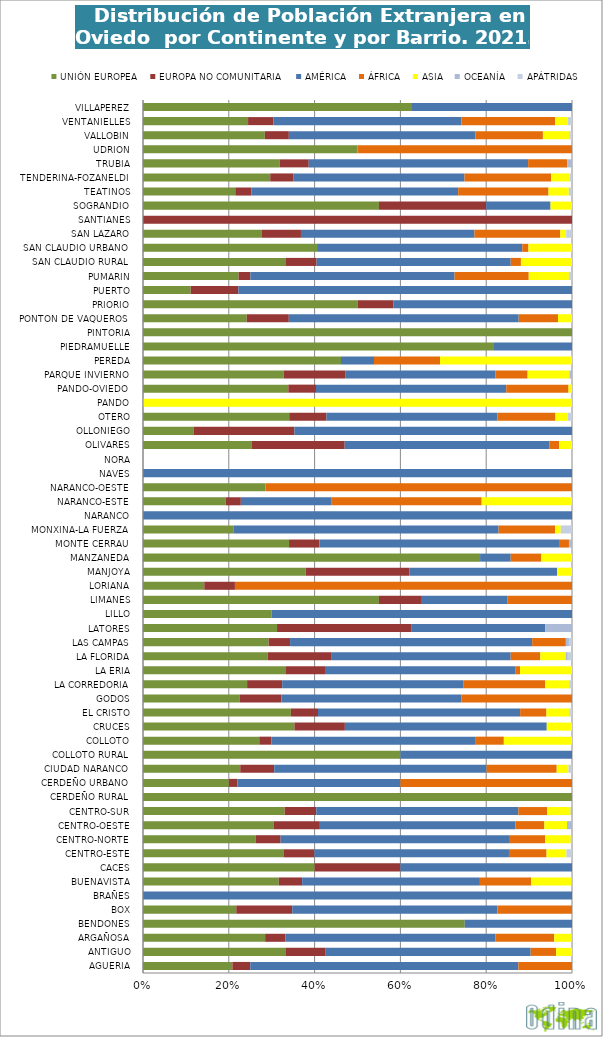
| Category | UNIÓN EUROPEA | EUROPA NO COMUNITARIA | AMÉRICA | ÁFRICA | ASIA | OCEANÍA | APÁTRIDAS |
|---|---|---|---|---|---|---|---|
| AGUERIA | 0.208 | 0.042 | 0.625 | 0.125 | 0 | 0 | 0 |
| ANTIGUO | 0.333 | 0.093 | 0.478 | 0.059 | 0.037 | 0 | 0 |
| ARGAÑOSA | 0.285 | 0.047 | 0.49 | 0.137 | 0.041 | 0 | 0.001 |
| BENDONES | 0.75 | 0 | 0.25 | 0 | 0 | 0 | 0 |
| BOX | 0.217 | 0.13 | 0.478 | 0.174 | 0 | 0 | 0 |
| BRAÑES | 0 | 0 | 1 | 0 | 0 | 0 | 0 |
| BUENAVISTA | 0.317 | 0.054 | 0.414 | 0.12 | 0.094 | 0 | 0.001 |
| CACES | 0.4 | 0.2 | 0.4 | 0 | 0 | 0 | 0 |
| CENTRO-ESTE | 0.327 | 0.072 | 0.454 | 0.088 | 0.046 | 0 | 0.013 |
| CENTRO-NORTE | 0.263 | 0.058 | 0.534 | 0.082 | 0.06 | 0.001 | 0.002 |
| CENTRO-OESTE | 0.304 | 0.108 | 0.456 | 0.067 | 0.053 | 0.012 | 0 |
| CENTRO-SUR | 0.33 | 0.074 | 0.471 | 0.067 | 0.054 | 0.003 | 0 |
| CERDEÑO RURAL | 1 | 0 | 0 | 0 | 0 | 0 | 0 |
| CERDEÑO URBANO | 0.2 | 0.02 | 0.38 | 0.4 | 0 | 0 | 0 |
| CIUDAD NARANCO | 0.227 | 0.079 | 0.495 | 0.164 | 0.027 | 0 | 0.008 |
| COLLOTO RURAL | 0.6 | 0 | 0.4 | 0 | 0 | 0 | 0 |
| COLLOTO | 0.271 | 0.028 | 0.477 | 0.065 | 0.159 | 0 | 0 |
| CRUCES | 0.353 | 0.118 | 0.471 | 0 | 0.059 | 0 | 0 |
| EL CRISTO | 0.345 | 0.063 | 0.471 | 0.061 | 0.054 | 0.002 | 0.004 |
| GODOS | 0.226 | 0.097 | 0.419 | 0.258 | 0 | 0 | 0 |
| LA CORREDORIA | 0.242 | 0.082 | 0.421 | 0.191 | 0.056 | 0 | 0.006 |
| LA ERIA | 0.333 | 0.091 | 0.444 | 0.01 | 0.121 | 0 | 0 |
| LA FLORIDA | 0.291 | 0.148 | 0.419 | 0.069 | 0.059 | 0.005 | 0.01 |
| LAS CAMPAS | 0.293 | 0.05 | 0.564 | 0.079 | 0 | 0.007 | 0.007 |
| LATORES | 0.312 | 0.312 | 0.312 | 0 | 0 | 0.062 | 0 |
| LILLO | 0.3 | 0 | 0.7 | 0 | 0 | 0 | 0 |
| LIMANES | 0.55 | 0.1 | 0.2 | 0.15 | 0 | 0 | 0 |
| LORIANA | 0.143 | 0.071 | 0 | 0.786 | 0 | 0 | 0 |
| MANJOYA | 0.379 | 0.241 | 0.345 | 0 | 0.034 | 0 | 0 |
| MANZANEDA | 0.786 | 0 | 0.071 | 0.071 | 0.071 | 0 | 0 |
| MONTE CERRAU | 0.34 | 0.071 | 0.56 | 0.021 | 0 | 0.007 | 0 |
| MONXINA-LA FUERZA | 0.211 | 0 | 0.618 | 0.132 | 0.013 | 0 | 0.026 |
| NARANCO | 0 | 0 | 1 | 0 | 0 | 0 | 0 |
| NARANCO-ESTE | 0.193 | 0.035 | 0.211 | 0.351 | 0.211 | 0 | 0 |
| NARANCO-OESTE | 0.286 | 0 | 0 | 0.714 | 0 | 0 | 0 |
| NAVES | 0 | 0 | 1 | 0 | 0 | 0 | 0 |
| NORA | 0 | 0 | 0 | 0 | 0 | 0 | 0 |
| OLIVARES | 0.254 | 0.216 | 0.478 | 0.022 | 0.03 | 0 | 0 |
| OLLONIEGO | 0.118 | 0.235 | 0.647 | 0 | 0 | 0 | 0 |
| OTERO | 0.341 | 0.087 | 0.399 | 0.135 | 0.029 | 0 | 0.01 |
| PANDO | 0 | 0 | 0 | 0 | 1 | 0 | 0 |
| PANDO-OVIEDO | 0.339 | 0.065 | 0.444 | 0.145 | 0.008 | 0 | 0 |
| PARQUE INVIERNO | 0.328 | 0.144 | 0.351 | 0.075 | 0.098 | 0.006 | 0 |
| PEREDA | 0.462 | 0 | 0.077 | 0.154 | 0.308 | 0 | 0 |
| PIEDRAMUELLE | 0.818 | 0 | 0.182 | 0 | 0 | 0 | 0 |
| PINTORIA | 1 | 0 | 0 | 0 | 0 | 0 | 0 |
| PONTON DE VAQUEROS | 0.242 | 0.098 | 0.536 | 0.092 | 0.033 | 0 | 0 |
| PRIORIO | 0.5 | 0.083 | 0.417 | 0 | 0 | 0 | 0 |
| PUERTO | 0.111 | 0.111 | 0.778 | 0 | 0 | 0 | 0 |
| PUMARIN | 0.223 | 0.028 | 0.476 | 0.173 | 0.094 | 0.001 | 0.007 |
| SAN CLAUDIO RURAL | 0.333 | 0.071 | 0.452 | 0.024 | 0.119 | 0 | 0 |
| SAN CLAUDIO URBANO | 0.406 | 0 | 0.478 | 0.014 | 0.101 | 0 | 0 |
| SAN LAZARO | 0.277 | 0.091 | 0.405 | 0.2 | 0.014 | 0 | 0.014 |
| SANTIANES | 0 | 1 | 0 | 0 | 0 | 0 | 0 |
| SOGRANDIO | 0.55 | 0.25 | 0.15 | 0 | 0.05 | 0 | 0 |
| TEATINOS | 0.215 | 0.037 | 0.482 | 0.211 | 0.047 | 0 | 0.007 |
| TENDERINA-FOZANELDI | 0.297 | 0.055 | 0.398 | 0.202 | 0.043 | 0 | 0.005 |
| TRUBIA | 0.318 | 0.068 | 0.511 | 0.091 | 0 | 0.011 | 0 |
| UDRION | 0.5 | 0 | 0 | 0.5 | 0 | 0 | 0 |
| VALLOBIN | 0.284 | 0.056 | 0.435 | 0.157 | 0.062 | 0.002 | 0.004 |
| VENTANIELLES | 0.245 | 0.059 | 0.438 | 0.219 | 0.029 | 0 | 0.01 |
| VILLAPEREZ | 0.625 | 0 | 0.375 | 0 | 0 | 0 | 0 |